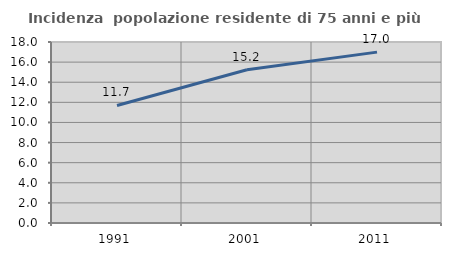
| Category | Incidenza  popolazione residente di 75 anni e più |
|---|---|
| 1991.0 | 11.688 |
| 2001.0 | 15.241 |
| 2011.0 | 16.993 |